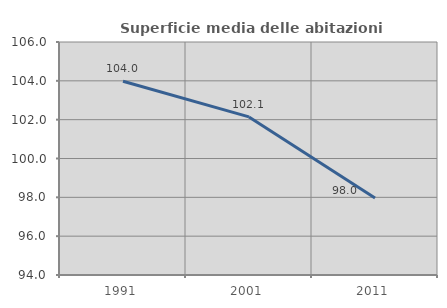
| Category | Superficie media delle abitazioni occupate |
|---|---|
| 1991.0 | 103.98 |
| 2001.0 | 102.143 |
| 2011.0 | 97.965 |